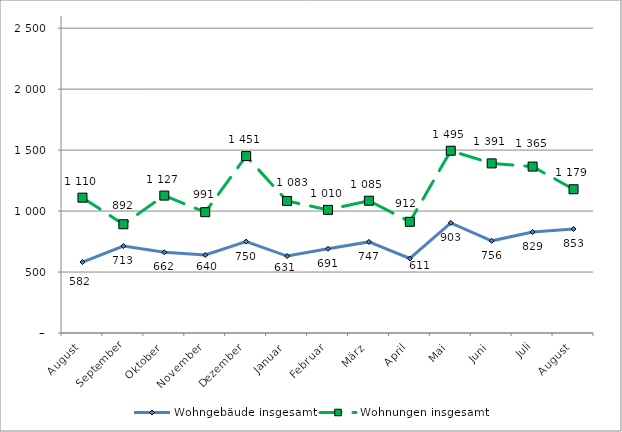
| Category | Wohngebäude insgesamt | Wohnungen insgesamt |
|---|---|---|
| August | 582 | 1110 |
| September | 713 | 892 |
| Oktober | 662 | 1127 |
| November | 640 | 991 |
| Dezember | 750 | 1451 |
| Januar | 631 | 1083 |
| Februar | 691 | 1010 |
| März | 747 | 1085 |
| April | 611 | 912 |
| Mai | 903 | 1495 |
| Juni | 756 | 1391 |
| Juli | 829 | 1365 |
| August | 853 | 1179 |